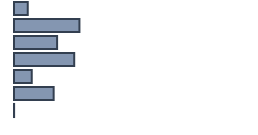
| Category | Percentatge |
|---|---|
| 0 | 5.696 |
| 1 | 27.261 |
| 2 | 17.957 |
| 3 | 25.087 |
| 4 | 7.435 |
| 5 | 16.522 |
| 6 | 0.043 |